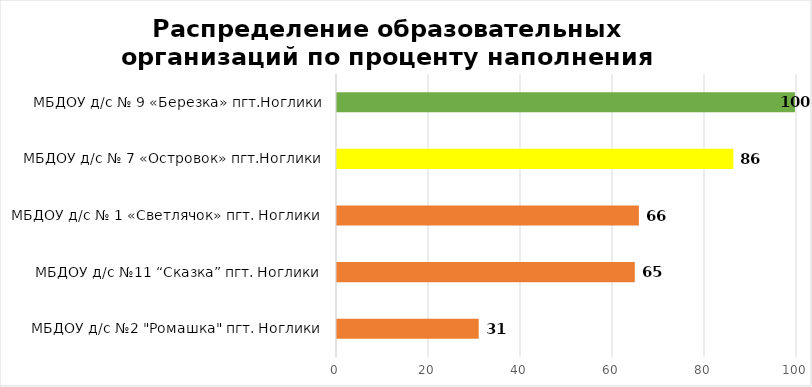
| Category | Series 0 |
|---|---|
| МБДОУ д/с №2 "Ромашка" пгт. Ноглики | 30.804 |
| МБДОУ д/с №11 “Сказка” пгт. Ноглики | 64.732 |
| МБДОУ д/с № 1 «Светлячок» пгт. Ноглики | 65.625 |
| МБДОУ д/с № 7 «Островок» пгт.Ноглики | 86.161 |
| МБДОУ д/с № 9 «Березка» пгт.Ноглики | 99.554 |